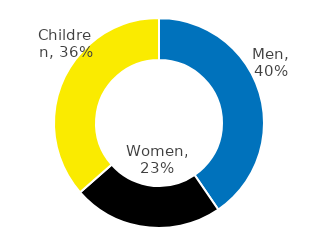
| Category | Series 0 |
|---|---|
| Men | 0.404 |
| Women | 0.231 |
| Children | 0.365 |